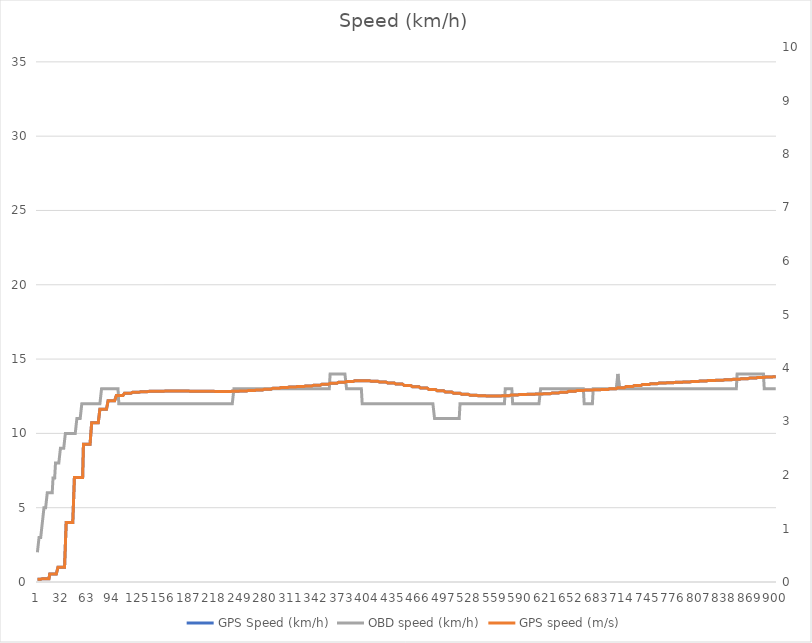
| Category | GPS Speed (km/h) | OBD speed (km/h) |
|---|---|---|
| 0 | 0.188 | 2 |
| 1 | 0.188 | 2 |
| 2 | 0.188 | 3 |
| 3 | 0.188 | 3 |
| 4 | 0.188 | 3 |
| 5 | 0.219 | 3 |
| 6 | 0.219 | 4 |
| 7 | 0.219 | 4 |
| 8 | 0.219 | 5 |
| 9 | 0.219 | 5 |
| 10 | 0.219 | 5 |
| 11 | 0.219 | 5 |
| 12 | 0.219 | 6 |
| 13 | 0.219 | 6 |
| 14 | 0.219 | 6 |
| 15 | 0.543 | 6 |
| 16 | 0.543 | 6 |
| 17 | 0.543 | 6 |
| 18 | 0.543 | 6 |
| 19 | 0.543 | 7 |
| 20 | 0.543 | 7 |
| 21 | 0.543 | 7 |
| 22 | 0.543 | 8 |
| 23 | 0.543 | 8 |
| 24 | 0.543 | 8 |
| 25 | 0.993 | 8 |
| 26 | 0.993 | 8 |
| 27 | 0.993 | 8 |
| 28 | 0.993 | 9 |
| 29 | 0.993 | 9 |
| 30 | 0.993 | 9 |
| 31 | 0.993 | 9 |
| 32 | 0.993 | 9 |
| 33 | 0.993 | 9 |
| 34 | 0.993 | 10 |
| 35 | 4.006 | 10 |
| 36 | 4.006 | 10 |
| 37 | 4.006 | 10 |
| 38 | 4.006 | 10 |
| 39 | 4.006 | 10 |
| 40 | 4.006 | 10 |
| 41 | 4.006 | 10 |
| 42 | 4.006 | 10 |
| 43 | 4.006 | 10 |
| 44 | 4.006 | 10 |
| 45 | 7.032 | 10 |
| 46 | 7.032 | 10 |
| 47 | 7.032 | 10 |
| 48 | 7.032 | 11 |
| 49 | 7.032 | 11 |
| 50 | 7.032 | 11 |
| 51 | 7.032 | 11 |
| 52 | 7.032 | 11 |
| 53 | 7.032 | 11 |
| 54 | 7.032 | 12 |
| 55 | 7.032 | 12 |
| 56 | 9.265 | 12 |
| 57 | 9.265 | 12 |
| 58 | 9.265 | 12 |
| 59 | 9.265 | 12 |
| 60 | 9.265 | 12 |
| 61 | 9.265 | 12 |
| 62 | 9.265 | 12 |
| 63 | 9.265 | 12 |
| 64 | 9.265 | 12 |
| 65 | 9.265 | 12 |
| 66 | 10.724 | 12 |
| 67 | 10.724 | 12 |
| 68 | 10.724 | 12 |
| 69 | 10.724 | 12 |
| 70 | 10.724 | 12 |
| 71 | 10.724 | 12 |
| 72 | 10.724 | 12 |
| 73 | 10.724 | 12 |
| 74 | 10.724 | 12 |
| 75 | 10.724 | 12 |
| 76 | 11.628 | 12 |
| 77 | 11.628 | 12 |
| 78 | 11.628 | 13 |
| 79 | 11.628 | 13 |
| 80 | 11.628 | 13 |
| 81 | 11.628 | 13 |
| 82 | 11.628 | 13 |
| 83 | 11.628 | 13 |
| 84 | 11.628 | 13 |
| 85 | 11.628 | 13 |
| 86 | 12.202 | 13 |
| 87 | 12.202 | 13 |
| 88 | 12.202 | 13 |
| 89 | 12.202 | 13 |
| 90 | 12.202 | 13 |
| 91 | 12.202 | 13 |
| 92 | 12.202 | 13 |
| 93 | 12.202 | 13 |
| 94 | 12.202 | 13 |
| 95 | 12.202 | 13 |
| 96 | 12.548 | 13 |
| 97 | 12.548 | 13 |
| 98 | 12.548 | 13 |
| 99 | 12.548 | 12 |
| 100 | 12.548 | 12 |
| 101 | 12.548 | 12 |
| 102 | 12.548 | 12 |
| 103 | 12.548 | 12 |
| 104 | 12.548 | 12 |
| 105 | 12.548 | 12 |
| 106 | 12.709 | 12 |
| 107 | 12.709 | 12 |
| 108 | 12.709 | 12 |
| 109 | 12.709 | 12 |
| 110 | 12.709 | 12 |
| 111 | 12.709 | 12 |
| 112 | 12.709 | 12 |
| 113 | 12.709 | 12 |
| 114 | 12.709 | 12 |
| 115 | 12.709 | 12 |
| 116 | 12.776 | 12 |
| 117 | 12.776 | 12 |
| 118 | 12.776 | 12 |
| 119 | 12.776 | 12 |
| 120 | 12.776 | 12 |
| 121 | 12.776 | 12 |
| 122 | 12.776 | 12 |
| 123 | 12.776 | 12 |
| 124 | 12.776 | 12 |
| 125 | 12.776 | 12 |
| 126 | 12.809 | 12 |
| 127 | 12.809 | 12 |
| 128 | 12.809 | 12 |
| 129 | 12.809 | 12 |
| 130 | 12.809 | 12 |
| 131 | 12.809 | 12 |
| 132 | 12.809 | 12 |
| 133 | 12.809 | 12 |
| 134 | 12.809 | 12 |
| 135 | 12.809 | 12 |
| 136 | 12.83 | 12 |
| 137 | 12.83 | 12 |
| 138 | 12.83 | 12 |
| 139 | 12.83 | 12 |
| 140 | 12.83 | 12 |
| 141 | 12.83 | 12 |
| 142 | 12.83 | 12 |
| 143 | 12.83 | 12 |
| 144 | 12.83 | 12 |
| 145 | 12.83 | 12 |
| 146 | 12.842 | 12 |
| 147 | 12.842 | 12 |
| 148 | 12.842 | 12 |
| 149 | 12.842 | 12 |
| 150 | 12.842 | 12 |
| 151 | 12.842 | 12 |
| 152 | 12.842 | 12 |
| 153 | 12.842 | 12 |
| 154 | 12.842 | 12 |
| 155 | 12.842 | 12 |
| 156 | 12.848 | 12 |
| 157 | 12.848 | 12 |
| 158 | 12.848 | 12 |
| 159 | 12.848 | 12 |
| 160 | 12.848 | 12 |
| 161 | 12.848 | 12 |
| 162 | 12.848 | 12 |
| 163 | 12.848 | 12 |
| 164 | 12.848 | 12 |
| 165 | 12.848 | 12 |
| 166 | 12.851 | 12 |
| 167 | 12.851 | 12 |
| 168 | 12.851 | 12 |
| 169 | 12.851 | 12 |
| 170 | 12.851 | 12 |
| 171 | 12.851 | 12 |
| 172 | 12.851 | 12 |
| 173 | 12.851 | 12 |
| 174 | 12.851 | 12 |
| 175 | 12.851 | 12 |
| 176 | 12.847 | 12 |
| 177 | 12.847 | 12 |
| 178 | 12.847 | 12 |
| 179 | 12.847 | 12 |
| 180 | 12.847 | 12 |
| 181 | 12.847 | 12 |
| 182 | 12.847 | 12 |
| 183 | 12.847 | 12 |
| 184 | 12.847 | 12 |
| 185 | 12.847 | 12 |
| 186 | 12.84 | 12 |
| 187 | 12.84 | 12 |
| 188 | 12.84 | 12 |
| 189 | 12.84 | 12 |
| 190 | 12.84 | 12 |
| 191 | 12.84 | 12 |
| 192 | 12.84 | 12 |
| 193 | 12.84 | 12 |
| 194 | 12.84 | 12 |
| 195 | 12.84 | 12 |
| 196 | 12.834 | 12 |
| 197 | 12.834 | 12 |
| 198 | 12.834 | 12 |
| 199 | 12.834 | 12 |
| 200 | 12.834 | 12 |
| 201 | 12.834 | 12 |
| 202 | 12.834 | 12 |
| 203 | 12.834 | 12 |
| 204 | 12.834 | 12 |
| 205 | 12.834 | 12 |
| 206 | 12.831 | 12 |
| 207 | 12.831 | 12 |
| 208 | 12.831 | 12 |
| 209 | 12.831 | 12 |
| 210 | 12.831 | 12 |
| 211 | 12.831 | 12 |
| 212 | 12.831 | 12 |
| 213 | 12.831 | 12 |
| 214 | 12.831 | 12 |
| 215 | 12.831 | 12 |
| 216 | 12.825 | 12 |
| 217 | 12.825 | 12 |
| 218 | 12.825 | 12 |
| 219 | 12.825 | 12 |
| 220 | 12.825 | 12 |
| 221 | 12.825 | 12 |
| 222 | 12.825 | 12 |
| 223 | 12.825 | 12 |
| 224 | 12.825 | 12 |
| 225 | 12.825 | 12 |
| 226 | 12.823 | 12 |
| 227 | 12.823 | 12 |
| 228 | 12.823 | 12 |
| 229 | 12.823 | 12 |
| 230 | 12.823 | 12 |
| 231 | 12.823 | 12 |
| 232 | 12.823 | 12 |
| 233 | 12.823 | 12 |
| 234 | 12.823 | 12 |
| 235 | 12.823 | 12 |
| 236 | 12.828 | 12 |
| 237 | 12.828 | 12 |
| 238 | 12.828 | 12 |
| 239 | 12.828 | 13 |
| 240 | 12.828 | 13 |
| 241 | 12.828 | 13 |
| 242 | 12.828 | 13 |
| 243 | 12.828 | 13 |
| 244 | 12.828 | 13 |
| 245 | 12.828 | 13 |
| 246 | 12.847 | 13 |
| 247 | 12.847 | 13 |
| 248 | 12.847 | 13 |
| 249 | 12.847 | 13 |
| 250 | 12.847 | 13 |
| 251 | 12.847 | 13 |
| 252 | 12.847 | 13 |
| 253 | 12.847 | 13 |
| 254 | 12.847 | 13 |
| 255 | 12.847 | 13 |
| 256 | 12.878 | 13 |
| 257 | 12.878 | 13 |
| 258 | 12.878 | 13 |
| 259 | 12.878 | 13 |
| 260 | 12.878 | 13 |
| 261 | 12.878 | 13 |
| 262 | 12.878 | 13 |
| 263 | 12.878 | 13 |
| 264 | 12.878 | 13 |
| 265 | 12.878 | 13 |
| 266 | 12.92 | 13 |
| 267 | 12.92 | 13 |
| 268 | 12.92 | 13 |
| 269 | 12.92 | 13 |
| 270 | 12.92 | 13 |
| 271 | 12.92 | 13 |
| 272 | 12.92 | 13 |
| 273 | 12.92 | 13 |
| 274 | 12.92 | 13 |
| 275 | 12.92 | 13 |
| 276 | 12.973 | 13 |
| 277 | 12.973 | 13 |
| 278 | 12.973 | 13 |
| 279 | 12.973 | 13 |
| 280 | 12.973 | 13 |
| 281 | 12.973 | 13 |
| 282 | 12.973 | 13 |
| 283 | 12.973 | 13 |
| 284 | 12.973 | 13 |
| 285 | 12.973 | 13 |
| 286 | 13.031 | 13 |
| 287 | 13.031 | 13 |
| 288 | 13.031 | 13 |
| 289 | 13.031 | 13 |
| 290 | 13.031 | 13 |
| 291 | 13.031 | 13 |
| 292 | 13.031 | 13 |
| 293 | 13.031 | 13 |
| 294 | 13.031 | 13 |
| 295 | 13.031 | 13 |
| 296 | 13.081 | 13 |
| 297 | 13.081 | 13 |
| 298 | 13.081 | 13 |
| 299 | 13.081 | 13 |
| 300 | 13.081 | 13 |
| 301 | 13.081 | 13 |
| 302 | 13.081 | 13 |
| 303 | 13.081 | 13 |
| 304 | 13.081 | 13 |
| 305 | 13.081 | 13 |
| 306 | 13.118 | 13 |
| 307 | 13.118 | 13 |
| 308 | 13.118 | 13 |
| 309 | 13.118 | 13 |
| 310 | 13.118 | 13 |
| 311 | 13.118 | 13 |
| 312 | 13.118 | 13 |
| 313 | 13.118 | 13 |
| 314 | 13.118 | 13 |
| 315 | 13.118 | 13 |
| 316 | 13.152 | 13 |
| 317 | 13.152 | 13 |
| 318 | 13.152 | 13 |
| 319 | 13.152 | 13 |
| 320 | 13.152 | 13 |
| 321 | 13.152 | 13 |
| 322 | 13.152 | 13 |
| 323 | 13.152 | 13 |
| 324 | 13.152 | 13 |
| 325 | 13.152 | 13 |
| 326 | 13.194 | 13 |
| 327 | 13.194 | 13 |
| 328 | 13.194 | 13 |
| 329 | 13.194 | 13 |
| 330 | 13.194 | 13 |
| 331 | 13.194 | 13 |
| 332 | 13.194 | 13 |
| 333 | 13.194 | 13 |
| 334 | 13.194 | 13 |
| 335 | 13.194 | 13 |
| 336 | 13.245 | 13 |
| 337 | 13.245 | 13 |
| 338 | 13.245 | 13 |
| 339 | 13.245 | 13 |
| 340 | 13.245 | 13 |
| 341 | 13.245 | 13 |
| 342 | 13.245 | 13 |
| 343 | 13.245 | 13 |
| 344 | 13.245 | 13 |
| 345 | 13.245 | 13 |
| 346 | 13.304 | 13 |
| 347 | 13.304 | 13 |
| 348 | 13.304 | 13 |
| 349 | 13.304 | 13 |
| 350 | 13.304 | 13 |
| 351 | 13.304 | 13 |
| 352 | 13.304 | 13 |
| 353 | 13.304 | 13 |
| 354 | 13.304 | 13 |
| 355 | 13.304 | 13 |
| 356 | 13.368 | 14 |
| 357 | 13.368 | 14 |
| 358 | 13.368 | 14 |
| 359 | 13.368 | 14 |
| 360 | 13.368 | 14 |
| 361 | 13.368 | 14 |
| 362 | 13.368 | 14 |
| 363 | 13.368 | 14 |
| 364 | 13.368 | 14 |
| 365 | 13.368 | 14 |
| 366 | 13.434 | 14 |
| 367 | 13.434 | 14 |
| 368 | 13.434 | 14 |
| 369 | 13.434 | 14 |
| 370 | 13.434 | 14 |
| 371 | 13.434 | 14 |
| 372 | 13.434 | 14 |
| 373 | 13.434 | 14 |
| 374 | 13.434 | 14 |
| 375 | 13.434 | 14 |
| 376 | 13.498 | 13 |
| 377 | 13.498 | 13 |
| 378 | 13.498 | 13 |
| 379 | 13.498 | 13 |
| 380 | 13.498 | 13 |
| 381 | 13.498 | 13 |
| 382 | 13.498 | 13 |
| 383 | 13.498 | 13 |
| 384 | 13.498 | 13 |
| 385 | 13.498 | 13 |
| 386 | 13.538 | 13 |
| 387 | 13.538 | 13 |
| 388 | 13.538 | 13 |
| 389 | 13.538 | 13 |
| 390 | 13.538 | 13 |
| 391 | 13.538 | 13 |
| 392 | 13.538 | 13 |
| 393 | 13.538 | 13 |
| 394 | 13.538 | 13 |
| 395 | 13.538 | 12 |
| 396 | 13.54 | 12 |
| 397 | 13.54 | 12 |
| 398 | 13.54 | 12 |
| 399 | 13.54 | 12 |
| 400 | 13.54 | 12 |
| 401 | 13.54 | 12 |
| 402 | 13.54 | 12 |
| 403 | 13.54 | 12 |
| 404 | 13.54 | 12 |
| 405 | 13.54 | 12 |
| 406 | 13.508 | 12 |
| 407 | 13.508 | 12 |
| 408 | 13.508 | 12 |
| 409 | 13.508 | 12 |
| 410 | 13.508 | 12 |
| 411 | 13.508 | 12 |
| 412 | 13.508 | 12 |
| 413 | 13.508 | 12 |
| 414 | 13.508 | 12 |
| 415 | 13.508 | 12 |
| 416 | 13.457 | 12 |
| 417 | 13.457 | 12 |
| 418 | 13.457 | 12 |
| 419 | 13.457 | 12 |
| 420 | 13.457 | 12 |
| 421 | 13.457 | 12 |
| 422 | 13.457 | 12 |
| 423 | 13.457 | 12 |
| 424 | 13.457 | 12 |
| 425 | 13.457 | 12 |
| 426 | 13.393 | 12 |
| 427 | 13.393 | 12 |
| 428 | 13.393 | 12 |
| 429 | 13.393 | 12 |
| 430 | 13.393 | 12 |
| 431 | 13.393 | 12 |
| 432 | 13.393 | 12 |
| 433 | 13.393 | 12 |
| 434 | 13.393 | 12 |
| 435 | 13.393 | 12 |
| 436 | 13.317 | 12 |
| 437 | 13.317 | 12 |
| 438 | 13.317 | 12 |
| 439 | 13.317 | 12 |
| 440 | 13.317 | 12 |
| 441 | 13.317 | 12 |
| 442 | 13.317 | 12 |
| 443 | 13.317 | 12 |
| 444 | 13.317 | 12 |
| 445 | 13.317 | 12 |
| 446 | 13.23 | 12 |
| 447 | 13.23 | 12 |
| 448 | 13.23 | 12 |
| 449 | 13.23 | 12 |
| 450 | 13.23 | 12 |
| 451 | 13.23 | 12 |
| 452 | 13.23 | 12 |
| 453 | 13.23 | 12 |
| 454 | 13.23 | 12 |
| 455 | 13.23 | 12 |
| 456 | 13.141 | 12 |
| 457 | 13.141 | 12 |
| 458 | 13.141 | 12 |
| 459 | 13.141 | 12 |
| 460 | 13.141 | 12 |
| 461 | 13.141 | 12 |
| 462 | 13.141 | 12 |
| 463 | 13.141 | 12 |
| 464 | 13.141 | 12 |
| 465 | 13.141 | 12 |
| 466 | 13.051 | 12 |
| 467 | 13.051 | 12 |
| 468 | 13.051 | 12 |
| 469 | 13.051 | 12 |
| 470 | 13.051 | 12 |
| 471 | 13.051 | 12 |
| 472 | 13.051 | 12 |
| 473 | 13.051 | 12 |
| 474 | 13.051 | 12 |
| 475 | 13.051 | 12 |
| 476 | 12.96 | 12 |
| 477 | 12.96 | 12 |
| 478 | 12.96 | 12 |
| 479 | 12.96 | 12 |
| 480 | 12.96 | 12 |
| 481 | 12.96 | 12 |
| 482 | 12.96 | 12 |
| 483 | 12.96 | 11 |
| 484 | 12.96 | 11 |
| 485 | 12.96 | 11 |
| 486 | 12.874 | 11 |
| 487 | 12.874 | 11 |
| 488 | 12.874 | 11 |
| 489 | 12.874 | 11 |
| 490 | 12.874 | 11 |
| 491 | 12.874 | 11 |
| 492 | 12.874 | 11 |
| 493 | 12.874 | 11 |
| 494 | 12.874 | 11 |
| 495 | 12.874 | 11 |
| 496 | 12.788 | 11 |
| 497 | 12.788 | 11 |
| 498 | 12.788 | 11 |
| 499 | 12.788 | 11 |
| 500 | 12.788 | 11 |
| 501 | 12.788 | 11 |
| 502 | 12.788 | 11 |
| 503 | 12.788 | 11 |
| 504 | 12.788 | 11 |
| 505 | 12.788 | 11 |
| 506 | 12.701 | 11 |
| 507 | 12.701 | 11 |
| 508 | 12.701 | 11 |
| 509 | 12.701 | 11 |
| 510 | 12.701 | 11 |
| 511 | 12.701 | 11 |
| 512 | 12.701 | 11 |
| 513 | 12.701 | 11 |
| 514 | 12.701 | 12 |
| 515 | 12.701 | 12 |
| 516 | 12.629 | 12 |
| 517 | 12.629 | 12 |
| 518 | 12.629 | 12 |
| 519 | 12.629 | 12 |
| 520 | 12.629 | 12 |
| 521 | 12.629 | 12 |
| 522 | 12.629 | 12 |
| 523 | 12.629 | 12 |
| 524 | 12.629 | 12 |
| 525 | 12.629 | 12 |
| 526 | 12.572 | 12 |
| 527 | 12.572 | 12 |
| 528 | 12.572 | 12 |
| 529 | 12.572 | 12 |
| 530 | 12.572 | 12 |
| 531 | 12.572 | 12 |
| 532 | 12.572 | 12 |
| 533 | 12.572 | 12 |
| 534 | 12.572 | 12 |
| 535 | 12.572 | 12 |
| 536 | 12.535 | 12 |
| 537 | 12.535 | 12 |
| 538 | 12.535 | 12 |
| 539 | 12.535 | 12 |
| 540 | 12.535 | 12 |
| 541 | 12.535 | 12 |
| 542 | 12.535 | 12 |
| 543 | 12.535 | 12 |
| 544 | 12.535 | 12 |
| 545 | 12.535 | 12 |
| 546 | 12.519 | 12 |
| 547 | 12.519 | 12 |
| 548 | 12.519 | 12 |
| 549 | 12.519 | 12 |
| 550 | 12.519 | 12 |
| 551 | 12.519 | 12 |
| 552 | 12.519 | 12 |
| 553 | 12.519 | 12 |
| 554 | 12.519 | 12 |
| 555 | 12.519 | 12 |
| 556 | 12.518 | 12 |
| 557 | 12.518 | 12 |
| 558 | 12.518 | 12 |
| 559 | 12.518 | 12 |
| 560 | 12.518 | 12 |
| 561 | 12.518 | 12 |
| 562 | 12.518 | 12 |
| 563 | 12.518 | 12 |
| 564 | 12.518 | 12 |
| 565 | 12.518 | 12 |
| 566 | 12.54 | 12 |
| 567 | 12.54 | 12 |
| 568 | 12.54 | 12 |
| 569 | 12.54 | 13 |
| 570 | 12.54 | 13 |
| 571 | 12.54 | 13 |
| 572 | 12.54 | 13 |
| 573 | 12.54 | 13 |
| 574 | 12.54 | 13 |
| 575 | 12.54 | 13 |
| 576 | 12.582 | 13 |
| 577 | 12.582 | 13 |
| 578 | 12.582 | 12 |
| 579 | 12.582 | 12 |
| 580 | 12.582 | 12 |
| 581 | 12.582 | 12 |
| 582 | 12.582 | 12 |
| 583 | 12.582 | 12 |
| 584 | 12.582 | 12 |
| 585 | 12.582 | 12 |
| 586 | 12.613 | 12 |
| 587 | 12.613 | 12 |
| 588 | 12.613 | 12 |
| 589 | 12.613 | 12 |
| 590 | 12.613 | 12 |
| 591 | 12.613 | 12 |
| 592 | 12.613 | 12 |
| 593 | 12.613 | 12 |
| 594 | 12.613 | 12 |
| 595 | 12.613 | 12 |
| 596 | 12.631 | 12 |
| 597 | 12.631 | 12 |
| 598 | 12.631 | 12 |
| 599 | 12.631 | 12 |
| 600 | 12.631 | 12 |
| 601 | 12.631 | 12 |
| 602 | 12.631 | 12 |
| 603 | 12.631 | 12 |
| 604 | 12.631 | 12 |
| 605 | 12.631 | 12 |
| 606 | 12.646 | 12 |
| 607 | 12.646 | 12 |
| 608 | 12.646 | 12 |
| 609 | 12.646 | 12 |
| 610 | 12.646 | 12 |
| 611 | 12.646 | 12 |
| 612 | 12.646 | 13 |
| 613 | 12.646 | 13 |
| 614 | 12.646 | 13 |
| 615 | 12.646 | 13 |
| 616 | 12.673 | 13 |
| 617 | 12.673 | 13 |
| 618 | 12.673 | 13 |
| 619 | 12.673 | 13 |
| 620 | 12.673 | 13 |
| 621 | 12.673 | 13 |
| 622 | 12.673 | 13 |
| 623 | 12.673 | 13 |
| 624 | 12.673 | 13 |
| 625 | 12.673 | 13 |
| 626 | 12.717 | 13 |
| 627 | 12.717 | 13 |
| 628 | 12.717 | 13 |
| 629 | 12.717 | 13 |
| 630 | 12.717 | 13 |
| 631 | 12.717 | 13 |
| 632 | 12.717 | 13 |
| 633 | 12.717 | 13 |
| 634 | 12.717 | 13 |
| 635 | 12.717 | 13 |
| 636 | 12.772 | 13 |
| 637 | 12.772 | 13 |
| 638 | 12.772 | 13 |
| 639 | 12.772 | 13 |
| 640 | 12.772 | 13 |
| 641 | 12.772 | 13 |
| 642 | 12.772 | 13 |
| 643 | 12.772 | 13 |
| 644 | 12.772 | 13 |
| 645 | 12.772 | 13 |
| 646 | 12.828 | 13 |
| 647 | 12.828 | 13 |
| 648 | 12.828 | 13 |
| 649 | 12.828 | 13 |
| 650 | 12.828 | 13 |
| 651 | 12.828 | 13 |
| 652 | 12.828 | 13 |
| 653 | 12.828 | 13 |
| 654 | 12.828 | 13 |
| 655 | 12.828 | 13 |
| 656 | 12.878 | 13 |
| 657 | 12.878 | 13 |
| 658 | 12.878 | 13 |
| 659 | 12.878 | 13 |
| 660 | 12.878 | 13 |
| 661 | 12.878 | 13 |
| 662 | 12.878 | 13 |
| 663 | 12.878 | 13 |
| 664 | 12.878 | 13 |
| 665 | 12.878 | 12 |
| 666 | 12.915 | 12 |
| 667 | 12.915 | 12 |
| 668 | 12.915 | 12 |
| 669 | 12.915 | 12 |
| 670 | 12.915 | 12 |
| 671 | 12.915 | 12 |
| 672 | 12.915 | 12 |
| 673 | 12.915 | 12 |
| 674 | 12.915 | 12 |
| 675 | 12.915 | 12 |
| 676 | 12.929 | 13 |
| 677 | 12.929 | 13 |
| 678 | 12.929 | 13 |
| 679 | 12.929 | 13 |
| 680 | 12.929 | 13 |
| 681 | 12.929 | 13 |
| 682 | 12.929 | 13 |
| 683 | 12.929 | 13 |
| 684 | 12.929 | 13 |
| 685 | 12.929 | 13 |
| 686 | 12.954 | 13 |
| 687 | 12.954 | 13 |
| 688 | 12.954 | 13 |
| 689 | 12.954 | 13 |
| 690 | 12.954 | 13 |
| 691 | 12.954 | 13 |
| 692 | 12.954 | 13 |
| 693 | 12.954 | 13 |
| 694 | 12.954 | 13 |
| 695 | 12.954 | 13 |
| 696 | 13.008 | 13 |
| 697 | 13.008 | 13 |
| 698 | 13.008 | 13 |
| 699 | 13.008 | 13 |
| 700 | 13.008 | 13 |
| 701 | 13.008 | 13 |
| 702 | 13.008 | 13 |
| 703 | 13.008 | 13 |
| 704 | 13.008 | 13 |
| 705 | 13.008 | 13 |
| 706 | 13.078 | 14 |
| 707 | 13.078 | 14 |
| 708 | 13.078 | 13 |
| 709 | 13.078 | 13 |
| 710 | 13.078 | 13 |
| 711 | 13.078 | 13 |
| 712 | 13.078 | 13 |
| 713 | 13.078 | 13 |
| 714 | 13.078 | 13 |
| 715 | 13.078 | 13 |
| 716 | 13.15 | 13 |
| 717 | 13.15 | 13 |
| 718 | 13.15 | 13 |
| 719 | 13.15 | 13 |
| 720 | 13.15 | 13 |
| 721 | 13.15 | 13 |
| 722 | 13.15 | 13 |
| 723 | 13.15 | 13 |
| 724 | 13.15 | 13 |
| 725 | 13.15 | 13 |
| 726 | 13.222 | 13 |
| 727 | 13.222 | 13 |
| 728 | 13.222 | 13 |
| 729 | 13.222 | 13 |
| 730 | 13.222 | 13 |
| 731 | 13.222 | 13 |
| 732 | 13.222 | 13 |
| 733 | 13.222 | 13 |
| 734 | 13.222 | 13 |
| 735 | 13.222 | 13 |
| 736 | 13.289 | 13 |
| 737 | 13.289 | 13 |
| 738 | 13.289 | 13 |
| 739 | 13.289 | 13 |
| 740 | 13.289 | 13 |
| 741 | 13.289 | 13 |
| 742 | 13.289 | 13 |
| 743 | 13.289 | 13 |
| 744 | 13.289 | 13 |
| 745 | 13.289 | 13 |
| 746 | 13.343 | 13 |
| 747 | 13.343 | 13 |
| 748 | 13.343 | 13 |
| 749 | 13.343 | 13 |
| 750 | 13.343 | 13 |
| 751 | 13.343 | 13 |
| 752 | 13.343 | 13 |
| 753 | 13.343 | 13 |
| 754 | 13.343 | 13 |
| 755 | 13.343 | 13 |
| 756 | 13.385 | 13 |
| 757 | 13.385 | 13 |
| 758 | 13.385 | 13 |
| 759 | 13.385 | 13 |
| 760 | 13.385 | 13 |
| 761 | 13.385 | 13 |
| 762 | 13.385 | 13 |
| 763 | 13.385 | 13 |
| 764 | 13.385 | 13 |
| 765 | 13.385 | 13 |
| 766 | 13.415 | 13 |
| 767 | 13.415 | 13 |
| 768 | 13.415 | 13 |
| 769 | 13.415 | 13 |
| 770 | 13.415 | 13 |
| 771 | 13.415 | 13 |
| 772 | 13.415 | 13 |
| 773 | 13.415 | 13 |
| 774 | 13.415 | 13 |
| 775 | 13.415 | 13 |
| 776 | 13.438 | 13 |
| 777 | 13.438 | 13 |
| 778 | 13.438 | 13 |
| 779 | 13.438 | 13 |
| 780 | 13.438 | 13 |
| 781 | 13.438 | 13 |
| 782 | 13.438 | 13 |
| 783 | 13.438 | 13 |
| 784 | 13.438 | 13 |
| 785 | 13.438 | 13 |
| 786 | 13.464 | 13 |
| 787 | 13.464 | 13 |
| 788 | 13.464 | 13 |
| 789 | 13.464 | 13 |
| 790 | 13.464 | 13 |
| 791 | 13.464 | 13 |
| 792 | 13.464 | 13 |
| 793 | 13.464 | 13 |
| 794 | 13.464 | 13 |
| 795 | 13.464 | 13 |
| 796 | 13.494 | 13 |
| 797 | 13.494 | 13 |
| 798 | 13.494 | 13 |
| 799 | 13.494 | 13 |
| 800 | 13.494 | 13 |
| 801 | 13.494 | 13 |
| 802 | 13.494 | 13 |
| 803 | 13.494 | 13 |
| 804 | 13.494 | 13 |
| 805 | 13.494 | 13 |
| 806 | 13.53 | 13 |
| 807 | 13.53 | 13 |
| 808 | 13.53 | 13 |
| 809 | 13.53 | 13 |
| 810 | 13.53 | 13 |
| 811 | 13.53 | 13 |
| 812 | 13.53 | 13 |
| 813 | 13.53 | 13 |
| 814 | 13.53 | 13 |
| 815 | 13.53 | 13 |
| 816 | 13.56 | 13 |
| 817 | 13.56 | 13 |
| 818 | 13.56 | 13 |
| 819 | 13.56 | 13 |
| 820 | 13.56 | 13 |
| 821 | 13.56 | 13 |
| 822 | 13.56 | 13 |
| 823 | 13.56 | 13 |
| 824 | 13.56 | 13 |
| 825 | 13.56 | 13 |
| 826 | 13.581 | 13 |
| 827 | 13.581 | 13 |
| 828 | 13.581 | 13 |
| 829 | 13.581 | 13 |
| 830 | 13.581 | 13 |
| 831 | 13.581 | 13 |
| 832 | 13.581 | 13 |
| 833 | 13.581 | 13 |
| 834 | 13.581 | 13 |
| 835 | 13.581 | 13 |
| 836 | 13.606 | 13 |
| 837 | 13.606 | 13 |
| 838 | 13.606 | 13 |
| 839 | 13.606 | 13 |
| 840 | 13.606 | 13 |
| 841 | 13.606 | 13 |
| 842 | 13.606 | 13 |
| 843 | 13.606 | 13 |
| 844 | 13.606 | 13 |
| 845 | 13.606 | 13 |
| 846 | 13.639 | 13 |
| 847 | 13.639 | 13 |
| 848 | 13.639 | 13 |
| 849 | 13.639 | 13 |
| 850 | 13.639 | 13 |
| 851 | 13.639 | 14 |
| 852 | 13.639 | 14 |
| 853 | 13.639 | 14 |
| 854 | 13.639 | 14 |
| 855 | 13.639 | 14 |
| 856 | 13.677 | 14 |
| 857 | 13.677 | 14 |
| 858 | 13.677 | 14 |
| 859 | 13.677 | 14 |
| 860 | 13.677 | 14 |
| 861 | 13.677 | 14 |
| 862 | 13.677 | 14 |
| 863 | 13.677 | 14 |
| 864 | 13.677 | 14 |
| 865 | 13.677 | 14 |
| 866 | 13.72 | 14 |
| 867 | 13.72 | 14 |
| 868 | 13.72 | 14 |
| 869 | 13.72 | 14 |
| 870 | 13.72 | 14 |
| 871 | 13.72 | 14 |
| 872 | 13.72 | 14 |
| 873 | 13.72 | 14 |
| 874 | 13.72 | 14 |
| 875 | 13.72 | 14 |
| 876 | 13.762 | 14 |
| 877 | 13.762 | 14 |
| 878 | 13.762 | 14 |
| 879 | 13.762 | 14 |
| 880 | 13.762 | 14 |
| 881 | 13.762 | 14 |
| 882 | 13.762 | 14 |
| 883 | 13.762 | 14 |
| 884 | 13.762 | 13 |
| 885 | 13.762 | 13 |
| 886 | 13.8 | 13 |
| 887 | 13.8 | 13 |
| 888 | 13.8 | 13 |
| 889 | 13.8 | 13 |
| 890 | 13.8 | 13 |
| 891 | 13.8 | 13 |
| 892 | 13.8 | 13 |
| 893 | 13.8 | 13 |
| 894 | 13.8 | 13 |
| 895 | 13.8 | 13 |
| 896 | 13.818 | 13 |
| 897 | 13.818 | 13 |
| 898 | 13.818 | 13 |
| 899 | 13.818 | 13 |